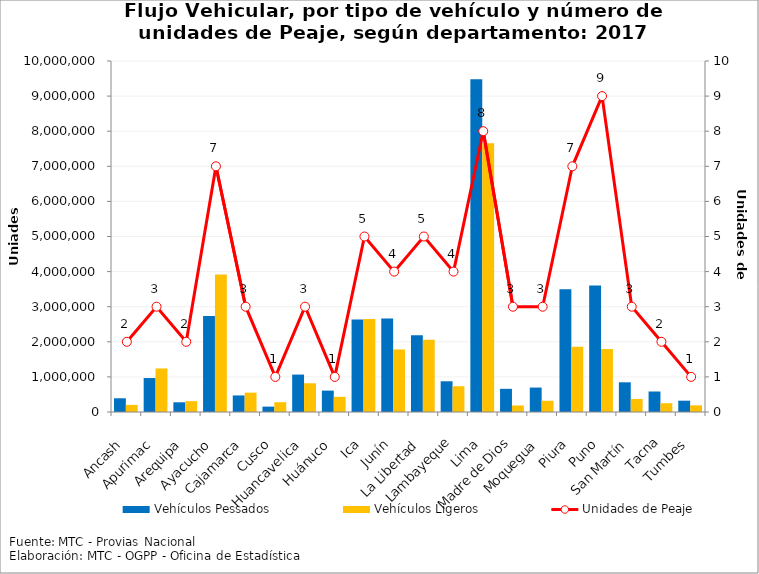
| Category | Vehículos Pessados | Vehículos Ligeros |
|---|---|---|
| 0 | 390980 | 202709 |
| 1 | 967836 | 1240283 |
| 2 | 276543 | 309206 |
| 3 | 2732128 | 3918567 |
| 4 | 471745 | 551202 |
| 5 | 153447 | 279370 |
| 6 | 1066298 | 818869 |
| 7 | 609588 | 432656 |
| 8 | 2634347 | 2648526 |
| 9 | 2661575 | 1781321 |
| 10 | 2186595 | 2056288 |
| 11 | 875294 | 734864 |
| 12 | 9483361 | 7657481 |
| 13 | 660417 | 186232 |
| 14 | 696212 | 320145 |
| 15 | 3498914 | 1860585 |
| 16 | 3605009 | 1793065 |
| 17 | 846067 | 370480 |
| 18 | 583971 | 250389 |
| 19 | 322305 | 189346 |